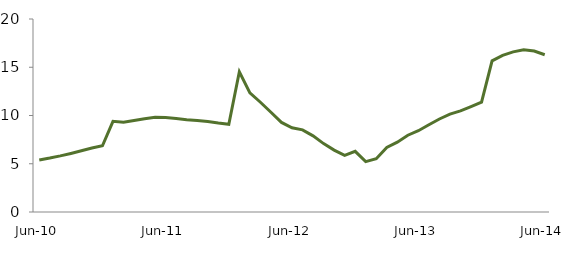
| Category | Series 0 |
|---|---|
| Jun-10 | 5.392 |
|  | 5.59 |
|  | 5.814 |
|  | 6.066 |
|  | 6.343 |
|  | 6.624 |
|  | 6.86 |
|  | 9.397 |
|  | 9.299 |
|  | 9.489 |
|  | 9.655 |
|  | 9.807 |
| Jun-11 | 9.788 |
|  | 9.681 |
|  | 9.551 |
|  | 9.482 |
|  | 9.372 |
|  | 9.217 |
|  | 9.093 |
|  | 14.528 |
|  | 12.349 |
|  | 11.373 |
|  | 10.337 |
|  | 9.286 |
| Jun-12 | 8.73 |
|  | 8.508 |
|  | 7.893 |
|  | 7.089 |
|  | 6.413 |
|  | 5.876 |
|  | 6.284 |
|  | 5.213 |
|  | 5.519 |
|  | 6.687 |
|  | 7.238 |
|  | 7.954 |
| Jun-13 | 8.423 |
|  | 9.043 |
|  | 9.636 |
|  | 10.148 |
|  | 10.484 |
|  | 10.93 |
|  | 11.389 |
|  | 15.665 |
|  | 16.236 |
|  | 16.597 |
|  | 16.81 |
|  | 16.684 |
| Jun-14 | 16.293 |